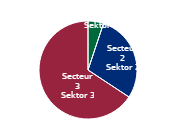
| Category | Series 0 |
|---|---|
| Secteur 1
Sektor 1 | 6195.185 |
| Secteur 2
Sektor 2 | 35292.293 |
| Secteur 3
Sektor 3 | 79552.816 |